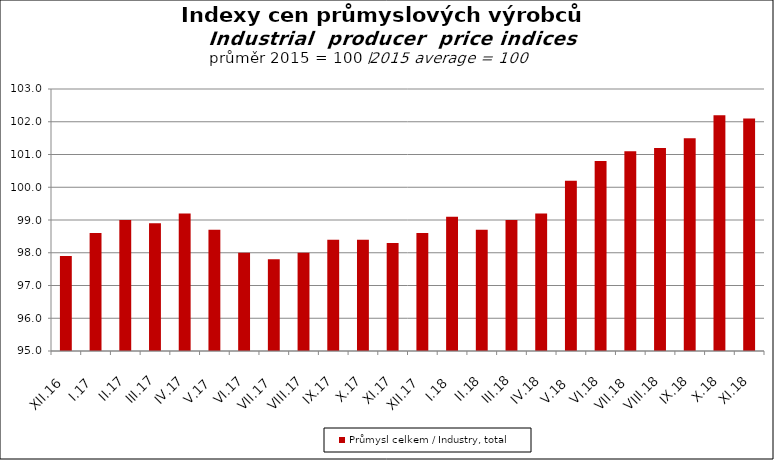
| Category | Průmysl celkem / Industry, total |
|---|---|
| XII.16 | 97.9 |
| I.17 | 98.6 |
| II.17 | 99 |
| III.17 | 98.9 |
| IV.17 | 99.2 |
| V.17 | 98.7 |
| VI.17 | 98 |
| VII.17 | 97.8 |
| VIII.17 | 98 |
| IX.17 | 98.4 |
| X.17 | 98.4 |
| XI.17 | 98.3 |
| XII.17 | 98.6 |
| I.18 | 99.1 |
| II.18 | 98.7 |
| III.18 | 99 |
| IV.18 | 99.2 |
| V.18 | 100.2 |
| VI.18 | 100.8 |
| VII.18 | 101.1 |
| VIII.18 | 101.2 |
| IX.18 | 101.5 |
| X.18 | 102.2 |
| XI.18 | 102.1 |